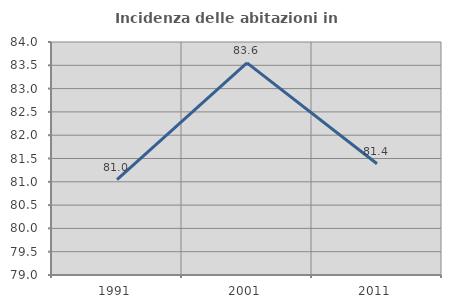
| Category | Incidenza delle abitazioni in proprietà  |
|---|---|
| 1991.0 | 81.044 |
| 2001.0 | 83.553 |
| 2011.0 | 81.388 |